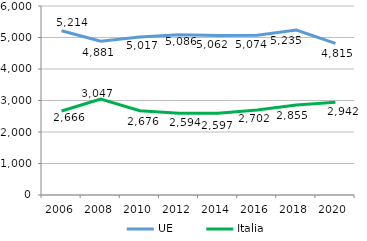
| Category | UE | Italia |
|---|---|---|
| 2006 | 5214 | 2666 |
| 2008 | 4881 | 3047 |
| 2010 | 5017 | 2676 |
| 2012 | 5086 | 2594 |
| 2014 | 5062 | 2597 |
| 2016 | 5074 | 2702 |
| 2018 | 5235 | 2855 |
| 2020 | 4815 | 2942 |